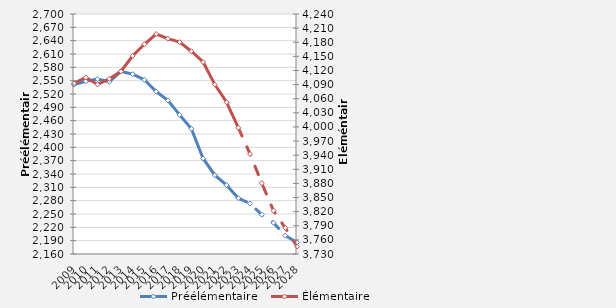
| Category | Préélémentaire |
|---|---|
| 2009.0 | 2541.04 |
| 2010.0 | 2548.715 |
| 2011.0 | 2553.567 |
| 2012.0 | 2547.414 |
| 2013.0 | 2570.9 |
| 2014.0 | 2564.606 |
| 2015.0 | 2552.014 |
| 2016.0 | 2525.465 |
| 2017.0 | 2505.653 |
| 2018.0 | 2473.058 |
| 2019.0 | 2441.82 |
| 2020.0 | 2374.98 |
| 2021.0 | 2337.371 |
| 2022.0 | 2314.893 |
| 2023.0 | 2285.599 |
| 2024.0 | 2273.553 |
| 2025.0 | 2248.455 |
| 2026.0 | 2230.21 |
| 2027.0 | 2201.466 |
| 2028.0 | 2186.022 |